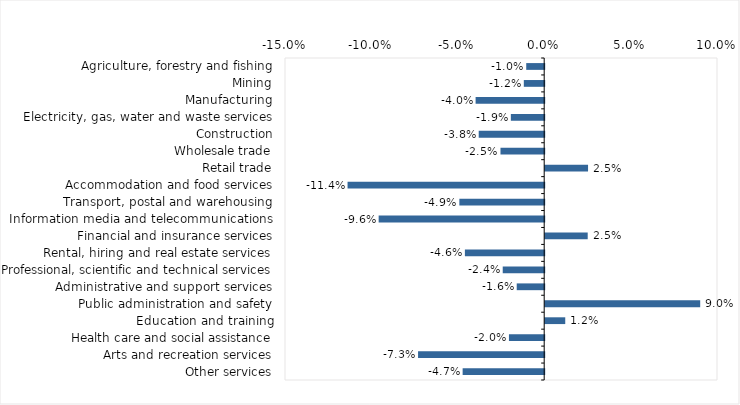
| Category | This week |
|---|---|
| Agriculture, forestry and fishing | -0.01 |
| Mining | -0.012 |
| Manufacturing | -0.04 |
| Electricity, gas, water and waste services | -0.019 |
| Construction | -0.038 |
| Wholesale trade | -0.025 |
| Retail trade | 0.025 |
| Accommodation and food services | -0.114 |
| Transport, postal and warehousing | -0.049 |
| Information media and telecommunications | -0.096 |
| Financial and insurance services | 0.025 |
| Rental, hiring and real estate services | -0.046 |
| Professional, scientific and technical services | -0.024 |
| Administrative and support services | -0.016 |
| Public administration and safety | 0.09 |
| Education and training | 0.012 |
| Health care and social assistance | -0.02 |
| Arts and recreation services | -0.073 |
| Other services | -0.047 |